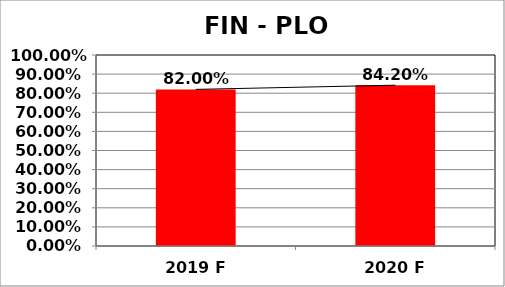
| Category | Series 0 |
|---|---|
| 2019 F | 0.82 |
| 2020 F | 0.842 |